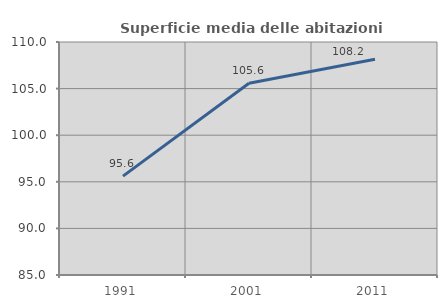
| Category | Superficie media delle abitazioni occupate |
|---|---|
| 1991.0 | 95.607 |
| 2001.0 | 105.577 |
| 2011.0 | 108.157 |